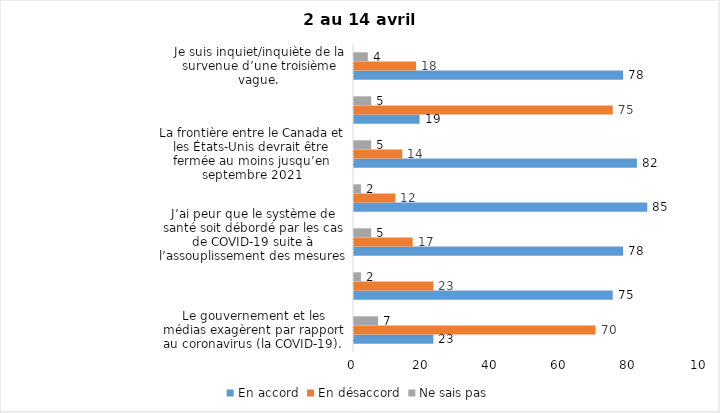
| Category | En accord | En désaccord | Ne sais pas |
|---|---|---|---|
| Le gouvernement et les médias exagèrent par rapport au coronavirus (la COVID-19). | 23 | 70 | 7 |
| Je suis favorable au maintien du couvre-feu pour les prochaines semaines. | 75 | 23 | 2 |
| J’ai peur que le système de santé soit débordé par les cas de COVID-19 suite à l’assouplissement des mesures | 78 | 17 | 5 |
| Je suis inquiet/inquiète  que le nombre de cas augmente en raison des nouveaux variants du virus de la COVID-19 | 85 | 12 | 2 |
| La frontière entre le Canada et les États-Unis devrait être fermée au moins jusqu’en septembre 2021 | 82 | 14 | 5 |
| Les personnes vaccinées contre la COVID-19 devraient avoir le droit de faire des rassemblements privés et de ne plus porter le masque dans les lieux publics. | 19 | 75 | 5 |
| Je suis inquiet/inquiète de la survenue d’une troisième vague. | 78 | 18 | 4 |